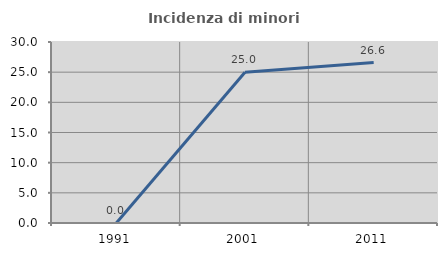
| Category | Incidenza di minori stranieri |
|---|---|
| 1991.0 | 0 |
| 2001.0 | 25 |
| 2011.0 | 26.601 |